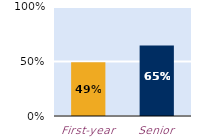
| Category | frequently |
|---|---|
| First-year | 0.493 |
| Senior | 0.647 |